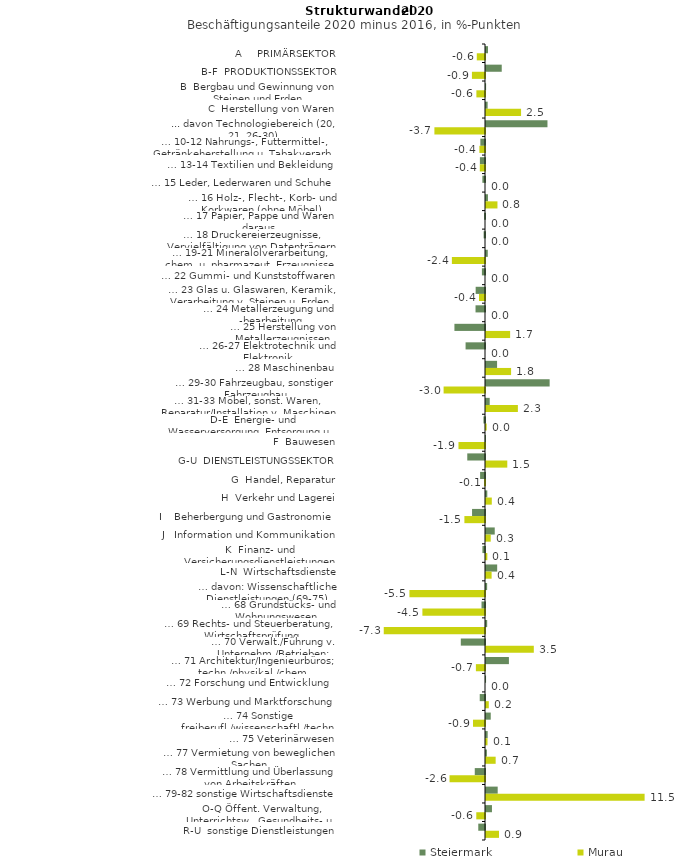
| Category | Steiermark | Murau |
|---|---|---|
| A     PRIMÄRSEKTOR | 0.145 | -0.595 |
| B-F  PRODUKTIONSSEKTOR | 1.14 | -0.947 |
| B  Bergbau und Gewinnung von Steinen und Erden | 0.008 | -0.624 |
| C  Herstellung von Waren | 0.118 | 2.541 |
| ... davon Technologiebereich (20, 21, 26-30) | 4.454 | -3.666 |
| … 10-12 Nahrungs-, Futtermittel-, Getränkeherstellung u. Tabakverarb. | -0.336 | -0.408 |
| … 13-14 Textilien und Bekleidung | -0.37 | -0.375 |
| … 15 Leder, Lederwaren und Schuhe | -0.191 | 0 |
| … 16 Holz-, Flecht-, Korb- und Korkwaren (ohne Möbel)  | 0.142 | 0.83 |
| … 17 Papier, Pappe und Waren daraus  | -0.062 | 0 |
| … 18 Druckereierzeugnisse, Vervielfältigung von Datenträgern | -0.099 | 0 |
| … 19-21 Mineralölverarbeitung, chem. u. pharmazeut. Erzeugnisse | 0.129 | -2.4 |
| … 22 Gummi- und Kunststoffwaren | -0.225 | 0 |
| … 23 Glas u. Glaswaren, Keramik, Verarbeitung v. Steinen u. Erden  | -0.677 | -0.435 |
| … 24 Metallerzeugung und -bearbeitung | -0.687 | 0 |
| … 25 Herstellung von Metallerzeugnissen  | -2.216 | 1.748 |
| … 26-27 Elektrotechnik und Elektronik | -1.407 | 0 |
| … 28 Maschinenbau | 0.802 | 1.818 |
| … 29-30 Fahrzeugbau, sonstiger Fahrzeugbau | 4.612 | -3 |
| … 31-33 Möbel, sonst. Waren, Reparatur/Installation v. Maschinen | 0.268 | 2.311 |
| D-E  Energie- und Wasserversorgung, Entsorgung u. Rückgewinnung | -0.111 | 0.05 |
| F  Bauwesen | -0.015 | -1.922 |
| G-U  DIENSTLEISTUNGSSEKTOR | -1.285 | 1.542 |
| G  Handel, Reparatur | -0.356 | -0.066 |
| H  Verkehr und Lagerei | 0.094 | 0.42 |
| I    Beherbergung und Gastronomie | -0.938 | -1.493 |
| J   Information und Kommunikation | 0.633 | 0.344 |
| K  Finanz- und Versicherungsdienstleistungen | -0.188 | 0.097 |
| L-N  Wirtschaftsdienste | 0.81 | 0.407 |
| … davon: Wissenschaftliche Dienstleistungen (69-75) | 0.083 | -5.475 |
| … 68 Grundstücks- und Wohnungswesen  | -0.253 | -4.536 |
| … 69 Rechts- und Steuerberatung, Wirtschaftsprüfung | 0.086 | -7.337 |
| … 70 Verwalt./Führung v. Unternehm./Betrieben; Unternehmensberat. | -1.753 | 3.465 |
| … 71 Architektur/Ingenieurbüros; techn./physikal./chem. Untersuchung | 1.66 | -0.66 |
| … 72 Forschung und Entwicklung  | 0.004 | 0 |
| … 73 Werbung und Marktforschung | -0.382 | 0.202 |
| … 74 Sonstige freiberufl./wissenschaftl./techn. Tätigkeiten | 0.344 | -0.868 |
| … 75 Veterinärwesen | 0.121 | 0.11 |
| … 77 Vermietung von beweglichen Sachen  | 0.066 | 0.7 |
| … 78 Vermittlung und Überlassung von Arbeitskräften | -0.742 | -2.569 |
| … 79-82 sonstige Wirtschaftsdienste | 0.848 | 11.493 |
| O-Q Öffent. Verwaltung, Unterrichtsw., Gesundheits- u. Sozialwesen | 0.432 | -0.631 |
| R-U  sonstige Dienstleistungen | -0.488 | 0.944 |